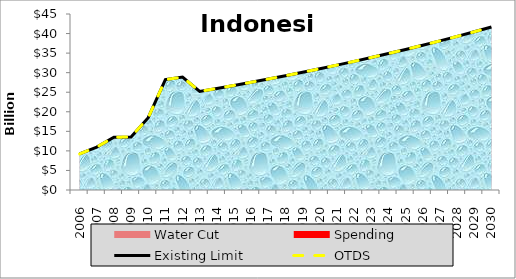
| Category | Existing Limit | OTDS |
|---|---|---|
| 0 | 9216450000 | 9216450000 |
| 1 | 10985478000 | 10985478000 |
| 2 | 13481302000 | 13481302000 |
| 3 | 13559770000 | 13559770000 |
| 4 | 18491138000 | 18491138000 |
| 5 | 28223174000 | 28223174000 |
| 6 | 28859560000 | 28859560000 |
| 7 | 25209368000 | 25209368000 |
| 8 | 25965649040 | 25965649040 |
| 9 | 26744618511.2 | 26744618511.2 |
| 10 | 27546957066.536 | 27546957066.536 |
| 11 | 28373365778.532 | 28373365778.532 |
| 12 | 29224566751.888 | 29224566751.888 |
| 13 | 30101303754.445 | 30101303754.445 |
| 14 | 31004342867.078 | 31004342867.078 |
| 15 | 31934473153.09 | 31934473153.09 |
| 16 | 32892507347.683 | 32892507347.683 |
| 17 | 33879282568.114 | 33879282568.114 |
| 18 | 34895661045.157 | 34895661045.157 |
| 19 | 35942530876.512 | 35942530876.512 |
| 20 | 37020806802.807 | 37020806802.807 |
| 21 | 38131431006.891 | 38131431006.891 |
| 22 | 39275373937.098 | 39275373937.098 |
| 23 | 40453635155.211 | 40453635155.211 |
| 24 | 41667244209.867 | 41667244209.867 |